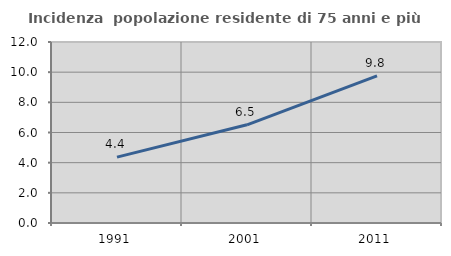
| Category | Incidenza  popolazione residente di 75 anni e più |
|---|---|
| 1991.0 | 4.366 |
| 2001.0 | 6.512 |
| 2011.0 | 9.758 |